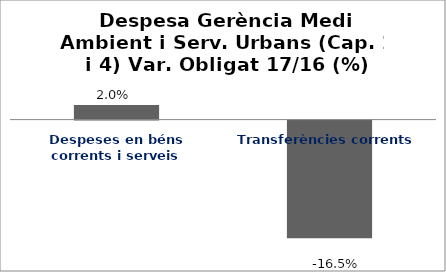
| Category | Series 0 |
|---|---|
| Despeses en béns corrents i serveis | 0.02 |
| Transferències corrents | -0.165 |